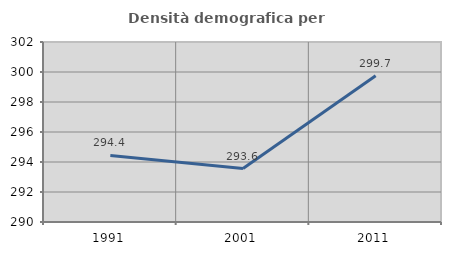
| Category | Densità demografica |
|---|---|
| 1991.0 | 294.434 |
| 2001.0 | 293.561 |
| 2011.0 | 299.749 |